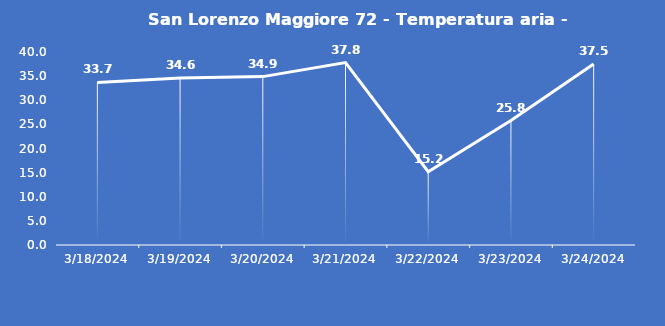
| Category | San Lorenzo Maggiore 72 - Temperatura aria - Grezzo (°C) |
|---|---|
| 3/18/24 | 33.7 |
| 3/19/24 | 34.6 |
| 3/20/24 | 34.9 |
| 3/21/24 | 37.8 |
| 3/22/24 | 15.2 |
| 3/23/24 | 25.8 |
| 3/24/24 | 37.5 |